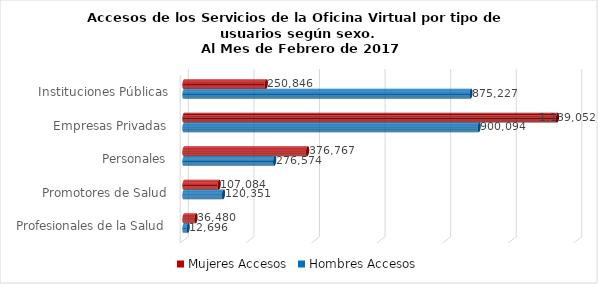
| Category | Mujeres | Hombres |
|---|---|---|
| Instituciones Públicas | 250846 | 875227 |
| Empresas Privadas | 1139052 | 900094 |
| Personales | 376767 | 276574 |
| Promotores de Salud | 107084 | 120351 |
| Profesionales de la Salud | 36480 | 12696 |